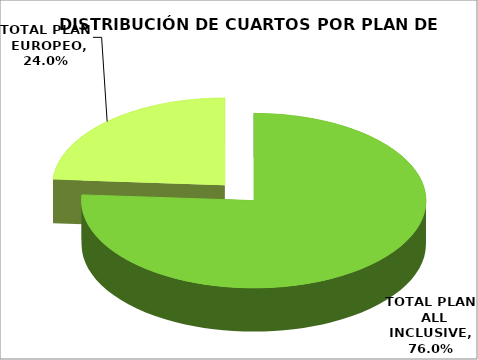
| Category | TOTAL PLAN  ALL INCLUSIVE TOTAL PLAN  EUROPEO |
|---|---|
| TOTAL PLAN  ALL INCLUSIVE | 0.76 |
| TOTAL PLAN  EUROPEO | 0.24 |